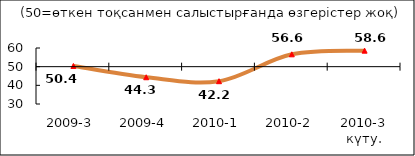
| Category | Series 5 |
|---|---|
| 2009-3 | 50.375 |
| 2009-4 | 44.335 |
| 2010-1 | 42.22 |
| 2010-2 | 56.61 |
| 2010-3 күту. | 58.575 |